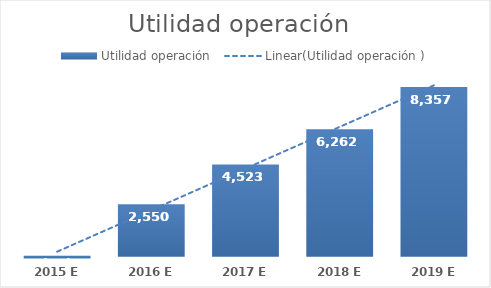
| Category | Utilidad operación  |
|---|---|
| 2015 E | -83.144 |
| 2016 E | 2550.212 |
| 2017 E | 4522.959 |
| 2018 E | 6262.483 |
| 2019 E | 8356.77 |